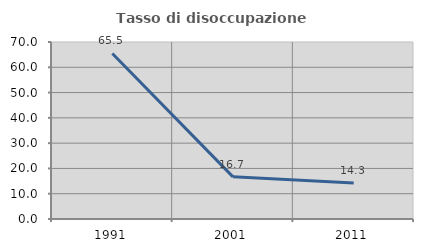
| Category | Tasso di disoccupazione giovanile  |
|---|---|
| 1991.0 | 65.476 |
| 2001.0 | 16.667 |
| 2011.0 | 14.286 |